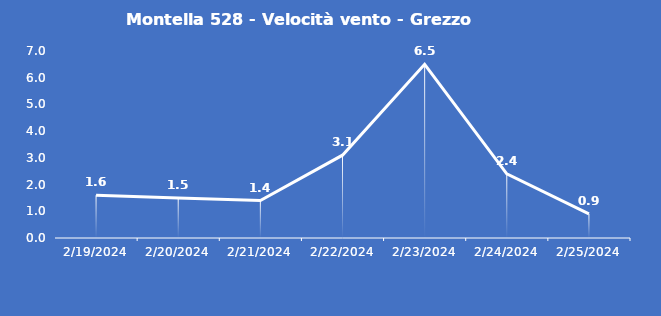
| Category | Montella 528 - Velocità vento - Grezzo (m/s) |
|---|---|
| 2/19/24 | 1.6 |
| 2/20/24 | 1.5 |
| 2/21/24 | 1.4 |
| 2/22/24 | 3.1 |
| 2/23/24 | 6.5 |
| 2/24/24 | 2.4 |
| 2/25/24 | 0.9 |